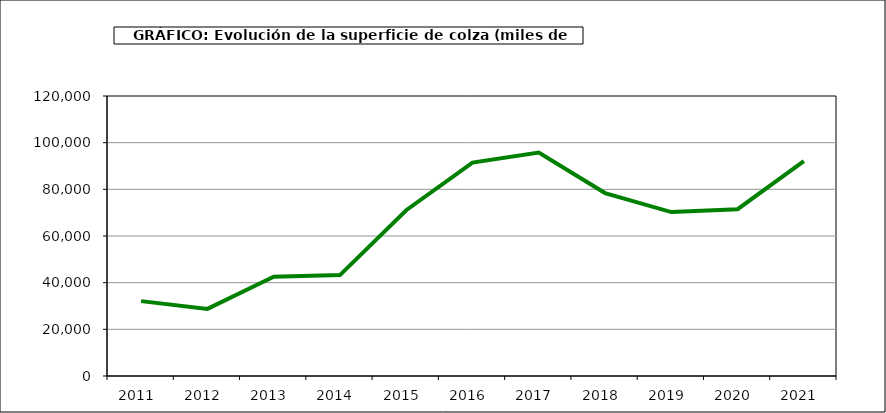
| Category | Superficie |
|---|---|
| 2011.0 | 32091 |
| 2012.0 | 28757 |
| 2013.0 | 42549 |
| 2014.0 | 43244 |
| 2015.0 | 71040 |
| 2016.0 | 91459 |
| 2017.0 | 95801 |
| 2018.0 | 78401 |
| 2019.0 | 70255 |
| 2020.0 | 71473 |
| 2021.0 | 92098 |